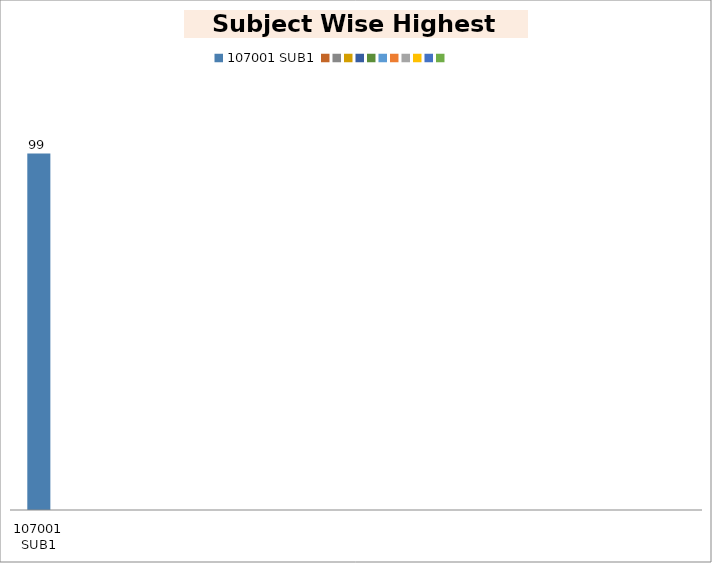
| Category | Series 0 |
|---|---|
| 107001 SUB1 | 99 |